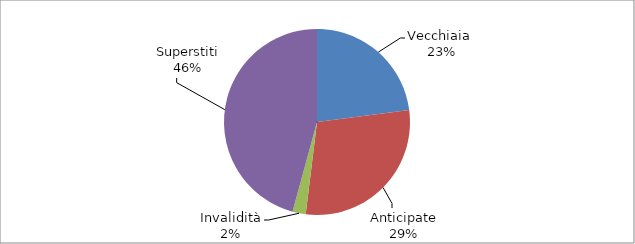
| Category | Series 0 |
|---|---|
| Vecchiaia  | 6472 |
| Anticipate | 8184 |
| Invalidità | 650 |
| Superstiti | 12912 |